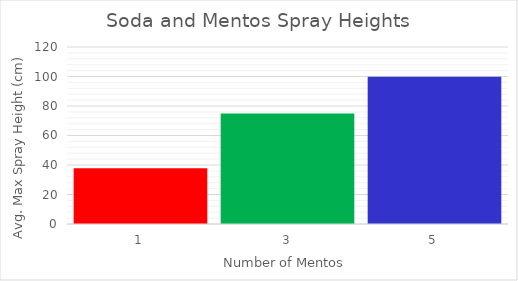
| Category | Avg Max Spray (cm) |
|---|---|
| 1.0 | 37.75 |
| 3.0 | 75 |
| 5.0 | 99.75 |